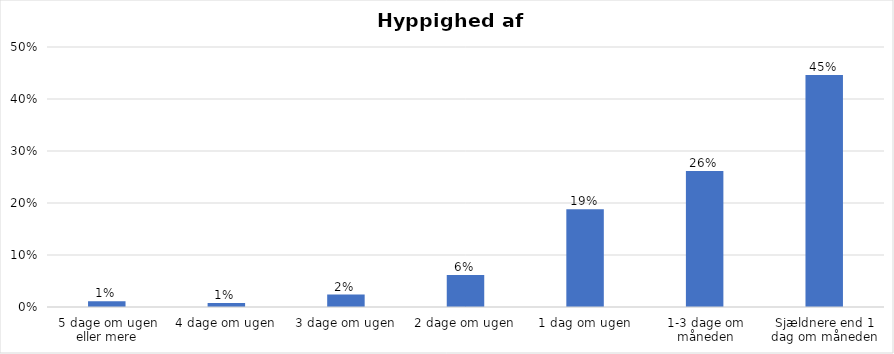
| Category | % |
|---|---|
| 5 dage om ugen eller mere | 0.011 |
| 4 dage om ugen | 0.008 |
| 3 dage om ugen | 0.024 |
| 2 dage om ugen | 0.061 |
| 1 dag om ugen | 0.188 |
| 1-3 dage om måneden | 0.262 |
| Sjældnere end 1 dag om måneden | 0.446 |